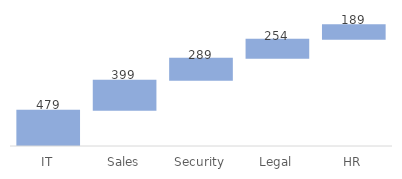
| Category | Series 0 | Series 1 |
|---|---|---|
| IT | 0 | 479 |
| Sales | 479 | 399 |
| Security | 878 | 289 |
| Legal | 1167 | 254 |
| HR | 1421 | 189 |